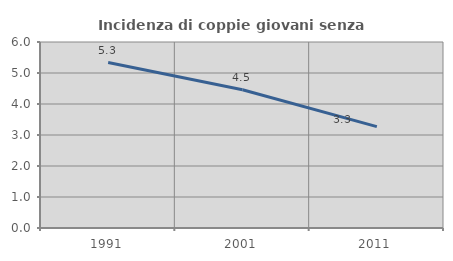
| Category | Incidenza di coppie giovani senza figli |
|---|---|
| 1991.0 | 5.338 |
| 2001.0 | 4.459 |
| 2011.0 | 3.271 |